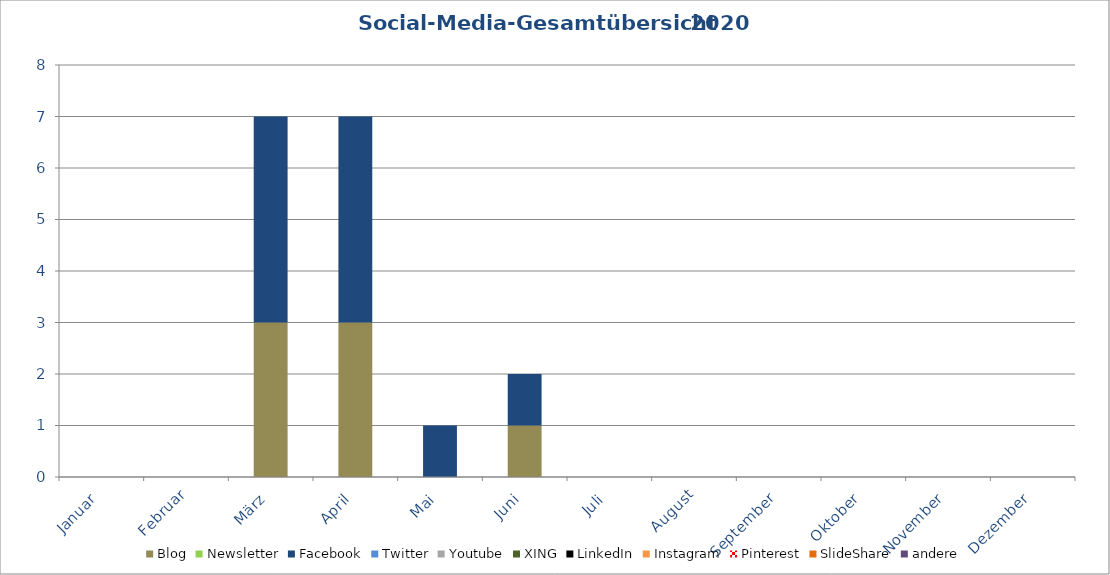
| Category | Blog | Newsletter | Facebook | Twitter | Youtube | XING | LinkedIn | Instagram | Pinterest | SlideShare | andere |
|---|---|---|---|---|---|---|---|---|---|---|---|
| Januar | 0 | 0 | 0 | 0 | 0 | 0 | 0 | 0 | 0 | 0 | 0 |
| Februar | 0 | 0 | 0 | 0 | 0 | 0 | 0 | 0 | 0 | 0 | 0 |
| März | 3 | 0 | 4 | 0 | 0 | 0 | 0 | 0 | 0 | 0 | 0 |
| April | 3 | 0 | 4 | 0 | 0 | 0 | 0 | 0 | 0 | 0 | 0 |
| Mai | 0 | 0 | 1 | 0 | 0 | 0 | 0 | 0 | 0 | 0 | 0 |
| Juni | 1 | 0 | 1 | 0 | 0 | 0 | 0 | 0 | 0 | 0 | 0 |
| Juli | 0 | 0 | 0 | 0 | 0 | 0 | 0 | 0 | 0 | 0 | 0 |
| August | 0 | 0 | 0 | 0 | 0 | 0 | 0 | 0 | 0 | 0 | 0 |
| September | 0 | 0 | 0 | 0 | 0 | 0 | 0 | 0 | 0 | 0 | 0 |
| Oktober | 0 | 0 | 0 | 0 | 0 | 0 | 0 | 0 | 0 | 0 | 0 |
| November | 0 | 0 | 0 | 0 | 0 | 0 | 0 | 0 | 0 | 0 | 0 |
| Dezember | 0 | 0 | 0 | 0 | 0 | 0 | 0 | 0 | 0 | 0 | 0 |